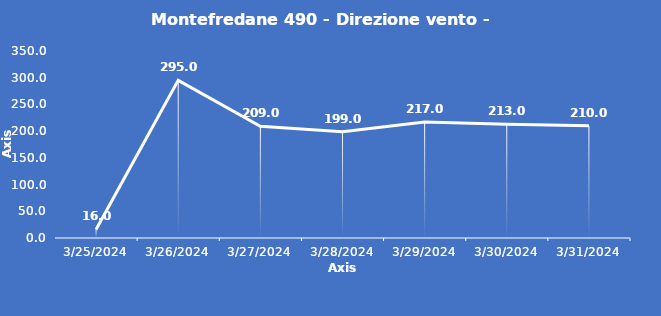
| Category | Montefredane 490 - Direzione vento - Grezzo (°N) |
|---|---|
| 3/25/24 | 16 |
| 3/26/24 | 295 |
| 3/27/24 | 209 |
| 3/28/24 | 199 |
| 3/29/24 | 217 |
| 3/30/24 | 213 |
| 3/31/24 | 210 |